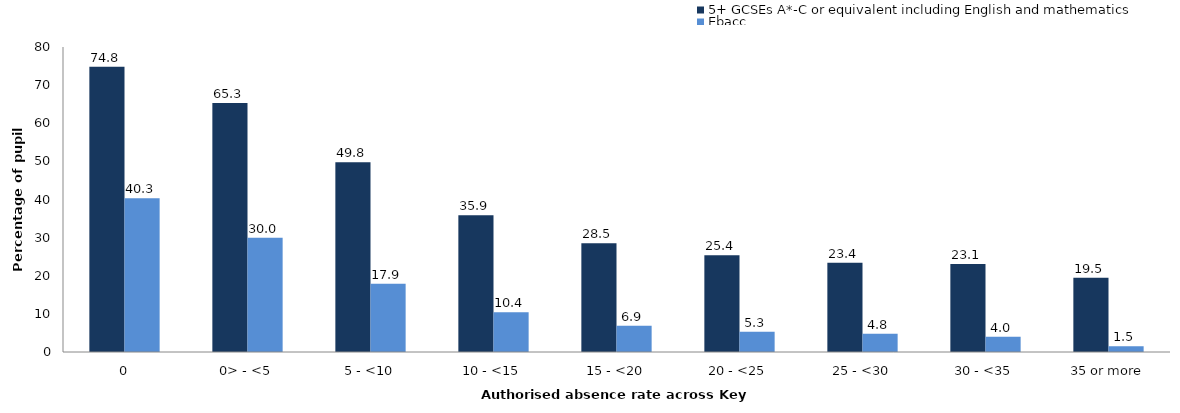
| Category | 5+ GCSEs A*-C or equivalent including English and mathematics | Ebacc |
|---|---|---|
| 0 | 74.8 | 40.3 |
| 0> - <5 | 65.3 | 30 |
| 5 - <10 | 49.8 | 17.9 |
| 10 - <15 | 35.9 | 10.4 |
| 15 - <20 | 28.5 | 6.9 |
| 20 - <25 | 25.4 | 5.3 |
| 25 - <30 | 23.4 | 4.8 |
| 30 - <35 | 23.1 | 4 |
| 35 or more | 19.5 | 1.5 |